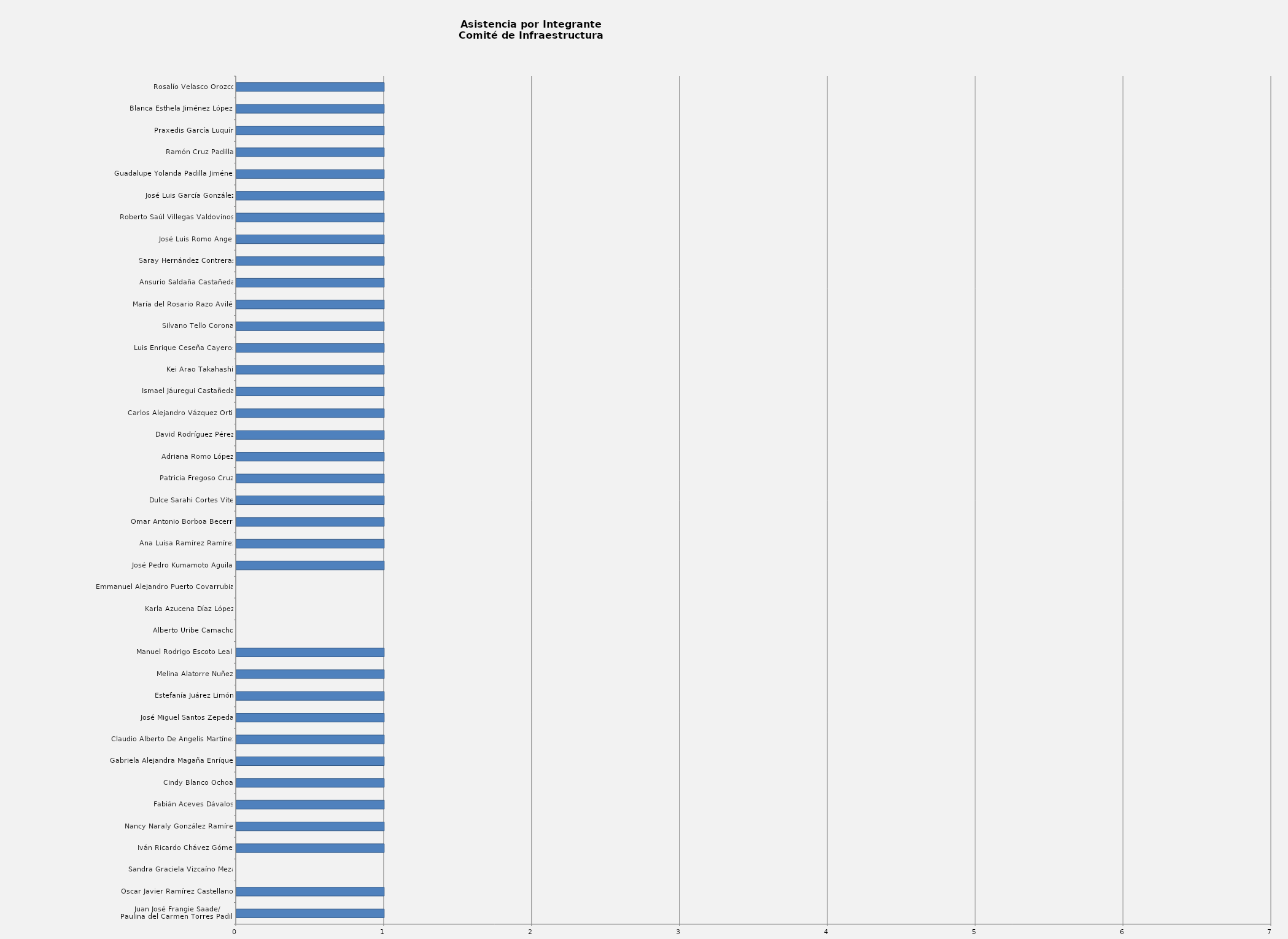
| Category | Series 0 |
|---|---|
| Juan José Frangie Saade/
Paulina del Carmen Torres Padilla | 1 |
| Oscar Javier Ramírez Castellanos | 1 |
| Sandra Graciela Vizcaíno Meza | 0 |
| Iván Ricardo Chávez Gómez | 1 |
| Nancy Naraly González Ramírez | 1 |
| Fabián Aceves Dávalos | 1 |
| Cindy Blanco Ochoa | 1 |
| Gabriela Alejandra Magaña Enríquez | 1 |
| Claudio Alberto De Angelis Martínez | 1 |
| José Miguel Santos Zepeda | 1 |
| Estefanía Juárez Limón | 1 |
| Melina Alatorre Nuñez | 1 |
| Manuel Rodrigo Escoto Leal  | 1 |
| Alberto Uribe Camacho | 0 |
| Karla Azucena Díaz López | 0 |
| Emmanuel Alejandro Puerto Covarrubias | 0 |
| José Pedro Kumamoto Aguilar | 1 |
| Ana Luisa Ramírez Ramírez | 1 |
| Omar Antonio Borboa Becerra | 1 |
| Dulce Sarahi Cortes Vite | 1 |
| Patricia Fregoso Cruz | 1 |
| Adriana Romo López | 1 |
| David Rodríguez Pérez | 1 |
| Carlos Alejandro Vázquez Ortiz | 1 |
| Ismael Jáuregui Castañeda | 1 |
| Kei Arao Takahashi | 1 |
| Luis Enrique Ceseña Cayeros | 1 |
| Silvano Tello Corona | 1 |
| María del Rosario Razo Avilés | 1 |
| Ansurio Saldaña Castañeda | 1 |
| Saray Hernández Contreras | 1 |
| José Luis Romo Ángel | 1 |
| Roberto Saúl Villegas Valdovinos  | 1 |
| José Luis García González | 1 |
| Guadalupe Yolanda Padilla Jiménez | 1 |
| Ramón Cruz Padilla | 1 |
| Praxedis García Luquín | 1 |
| Blanca Esthela Jiménez López  | 1 |
| Rosalío Velasco Orozco | 1 |